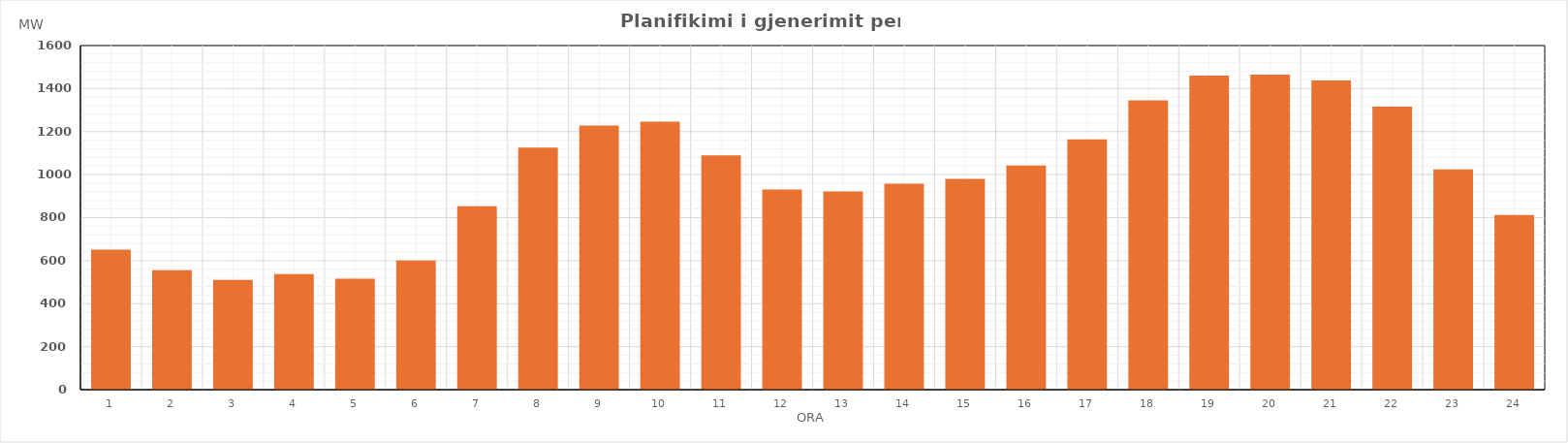
| Category | Max (MW) |
|---|---|
| 0 | 651.23 |
| 1 | 555.23 |
| 2 | 510.05 |
| 3 | 537.02 |
| 4 | 515.9 |
| 5 | 600.81 |
| 6 | 853.16 |
| 7 | 1125.3 |
| 8 | 1227.68 |
| 9 | 1245.72 |
| 10 | 1089.32 |
| 11 | 930.3 |
| 12 | 921.35 |
| 13 | 957.82 |
| 14 | 980.22 |
| 15 | 1042.74 |
| 16 | 1164.47 |
| 17 | 1345.61 |
| 18 | 1459.91 |
| 19 | 1464.96 |
| 20 | 1437.78 |
| 21 | 1316.59 |
| 22 | 1024.46 |
| 23 | 812.81 |